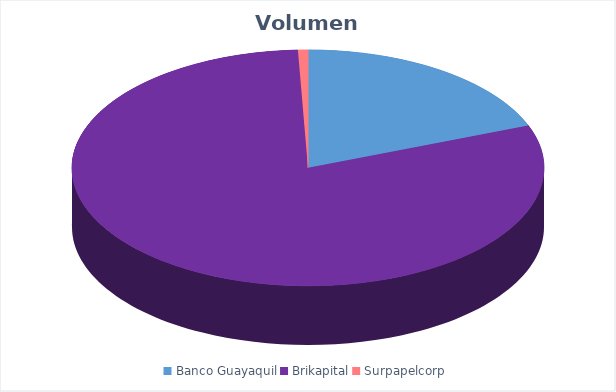
| Category | VOLUMEN ($USD) |
|---|---|
| Banco Guayaquil | 9545 |
| Brikapital | 40000 |
| Surpapelcorp | 340 |